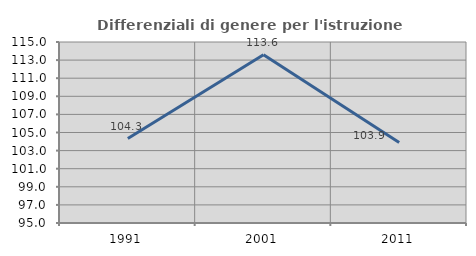
| Category | Differenziali di genere per l'istruzione superiore |
|---|---|
| 1991.0 | 104.334 |
| 2001.0 | 113.592 |
| 2011.0 | 103.895 |